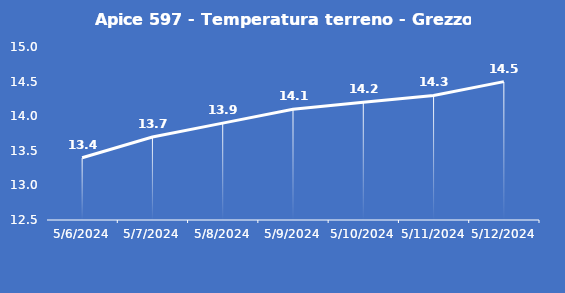
| Category | Apice 597 - Temperatura terreno - Grezzo (°C) |
|---|---|
| 5/6/24 | 13.4 |
| 5/7/24 | 13.7 |
| 5/8/24 | 13.9 |
| 5/9/24 | 14.1 |
| 5/10/24 | 14.2 |
| 5/11/24 | 14.3 |
| 5/12/24 | 14.5 |